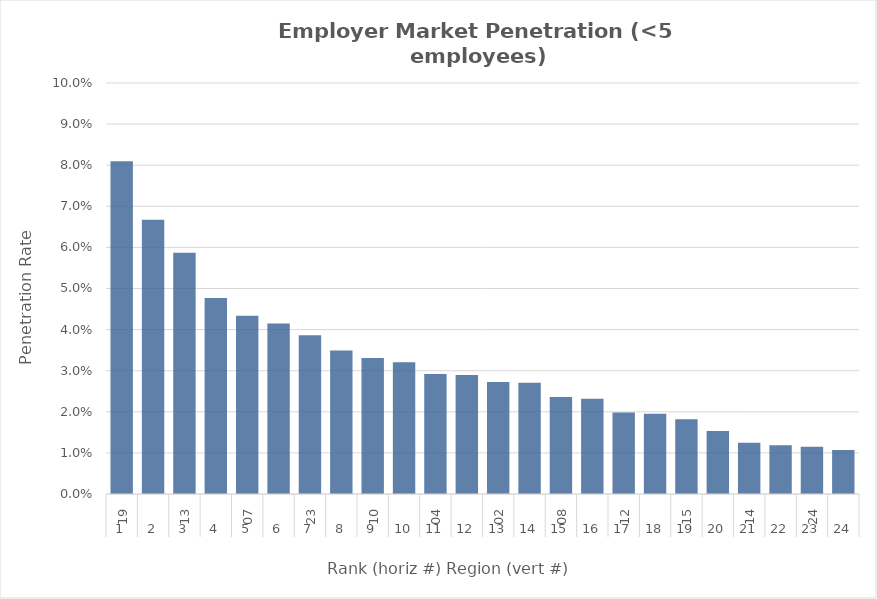
| Category | Rate |
|---|---|
| 0 | 0.081 |
| 1 | 0.067 |
| 2 | 0.059 |
| 3 | 0.048 |
| 4 | 0.043 |
| 5 | 0.042 |
| 6 | 0.039 |
| 7 | 0.035 |
| 8 | 0.033 |
| 9 | 0.032 |
| 10 | 0.029 |
| 11 | 0.029 |
| 12 | 0.027 |
| 13 | 0.027 |
| 14 | 0.024 |
| 15 | 0.023 |
| 16 | 0.02 |
| 17 | 0.02 |
| 18 | 0.018 |
| 19 | 0.015 |
| 20 | 0.012 |
| 21 | 0.012 |
| 22 | 0.011 |
| 23 | 0.011 |